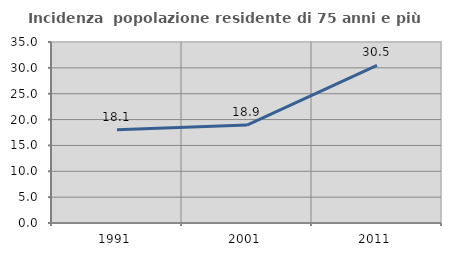
| Category | Incidenza  popolazione residente di 75 anni e più |
|---|---|
| 1991.0 | 18.056 |
| 2001.0 | 18.947 |
| 2011.0 | 30.496 |